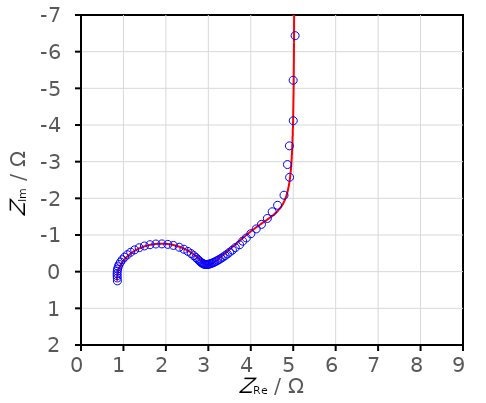
| Category | Calc. |
|---|---|
| 0.846072743587637 | 0.245 |
| 0.852160710886366 | 0.161 |
| 0.858791616021728 | 0.098 |
| 0.867280769617151 | 0.039 |
| 0.878250349406911 | -0.017 |
| 0.891692318656025 | -0.069 |
| 0.908261240429333 | -0.12 |
| 0.929255678018949 | -0.171 |
| 0.955337950653234 | -0.225 |
| 0.988415921031397 | -0.281 |
| 1.03030291128179 | -0.342 |
| 1.08258286401196 | -0.406 |
| 1.14701851350012 | -0.472 |
| 1.22578901333974 | -0.539 |
| 1.31973777555517 | -0.604 |
| 1.43000747478169 | -0.663 |
| 1.55499184463373 | -0.711 |
| 1.69194032448988 | -0.746 |
| 1.83612021519858 | -0.762 |
| 1.98132537476358 | -0.76 |
| 2.12198860763731 | -0.74 |
| 2.26615012225926 | -0.699 |
| 2.38468153456303 | -0.65 |
| 2.48757951809143 | -0.593 |
| 2.57473684693166 | -0.534 |
| 2.64726444630272 | -0.476 |
| 2.70696467355861 | -0.421 |
| 2.75589853156083 | -0.371 |
| 2.79609451094047 | -0.327 |
| 2.82938755396007 | -0.289 |
| 2.85735569656312 | -0.257 |
| 2.8813139146048 | -0.231 |
| 2.9023398097047 | -0.21 |
| 2.92131132499471 | -0.194 |
| 2.93894601170689 | -0.182 |
| 2.95583773011048 | -0.175 |
| 2.97248741046352 | -0.172 |
| 2.98932876278993 | -0.172 |
| 3.00674919459332 | -0.175 |
| 3.02510623994558 | -0.182 |
| 3.04474175002029 | -0.192 |
| 3.06599284013041 | -0.205 |
| 3.08920157496452 | -0.222 |
| 3.11472314717684 | -0.242 |
| 3.14293388285241 | -0.266 |
| 3.17423791084839 | -0.293 |
| 3.20907467679834 | -0.325 |
| 3.24792589443715 | -0.361 |
| 3.29132244354794 | -0.402 |
| 3.33985261708559 | -0.449 |
| 3.39417369068677 | -0.502 |
| 3.45502404423381 | -0.561 |
| 3.52317961818387 | -0.628 |
| 3.59939940869105 | -0.704 |
| 3.68468962934521 | -0.789 |
| 3.78100203157573 | -0.886 |
| 3.89154888047464 | -0.995 |
| 4.01949332211836 | -1.115 |
| 4.16490994973159 | -1.24 |
| 4.32188358810811 | -1.367 |
| 4.47860270072861 | -1.496 |
| 4.62149533838769 | -1.638 |
| 4.74065492465709 | -1.813 |
| 4.8325905072186 | -2.044 |
| 4.89927955264949 | -2.359 |
| 4.94549925326972 | -2.783 |
| 4.97652382100801 | -3.347 |
| 4.99690288354107 | -4.084 |
| 5.01009957723551 | -5.036 |
| 5.01856669406327 | -6.255 |
| 5.02396736314385 | -7.806 |
| 5.02739943006046 | -9.773 |
| 5.02957555012032 | -12.26 |
| 5.03095351607298 | -15.4 |
| 5.03182548167819 | -19.36 |
| 5.03237712979298 | -24.351 |
| 5.03272617213565 | -30.639 |
| 5.03294711479121 | -38.558 |
| 5.03308707243241 | -48.531 |
| 5.03317582322768 | -61.088 |
| 5.03323218372191 | -76.898 |